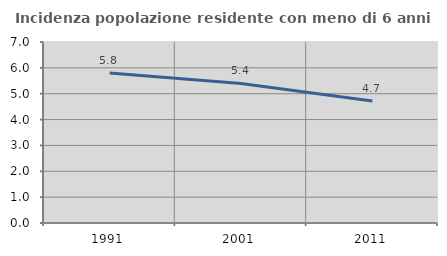
| Category | Incidenza popolazione residente con meno di 6 anni |
|---|---|
| 1991.0 | 5.8 |
| 2001.0 | 5.399 |
| 2011.0 | 4.715 |